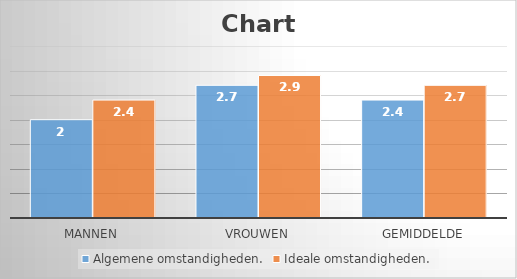
| Category | Algemene omstandigheden. | Ideale omstandigheden. |
|---|---|---|
| Mannen | 2 | 2.4 |
| Vrouwen | 2.7 | 2.9 |
| Gemiddelde | 2.4 | 2.7 |